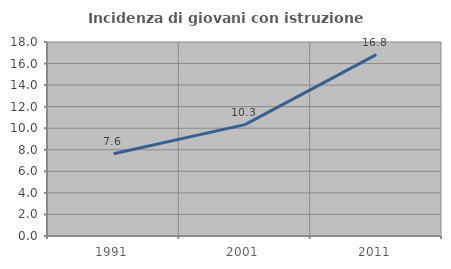
| Category | Incidenza di giovani con istruzione universitaria |
|---|---|
| 1991.0 | 7.625 |
| 2001.0 | 10.336 |
| 2011.0 | 16.822 |